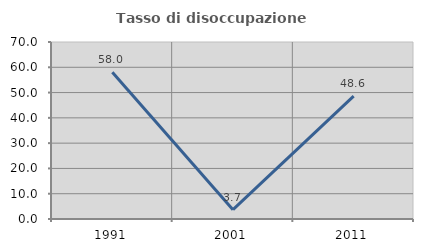
| Category | Tasso di disoccupazione giovanile  |
|---|---|
| 1991.0 | 58.015 |
| 2001.0 | 3.704 |
| 2011.0 | 48.611 |